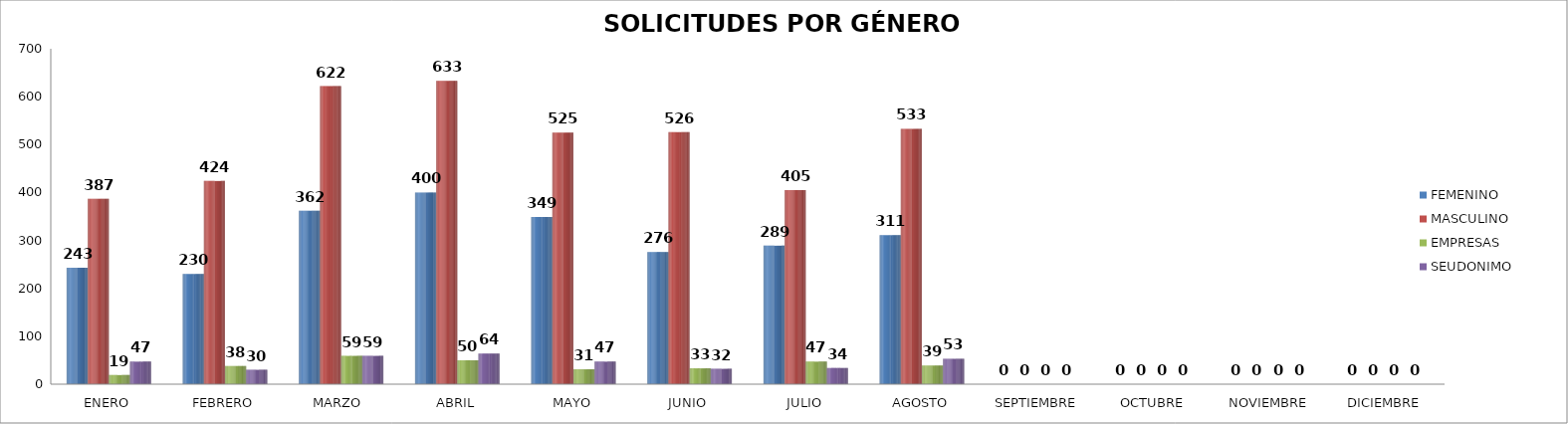
| Category | FEMENINO | MASCULINO | EMPRESAS | SEUDONIMO |
|---|---|---|---|---|
| ENERO | 243 | 387 | 19 | 47 |
| FEBRERO | 230 | 424 | 38 | 30 |
| MARZO  | 362 | 622 | 59 | 59 |
| ABRIL | 400 | 633 | 50 | 64 |
| MAYO | 349 | 525 | 31 | 47 |
| JUNIO | 276 | 526 | 33 | 32 |
| JULIO | 289 | 405 | 47 | 34 |
| AGOSTO | 311 | 533 | 39 | 53 |
| SEPTIEMBRE | 0 | 0 | 0 | 0 |
| OCTUBRE | 0 | 0 | 0 | 0 |
| NOVIEMBRE | 0 | 0 | 0 | 0 |
| DICIEMBRE | 0 | 0 | 0 | 0 |